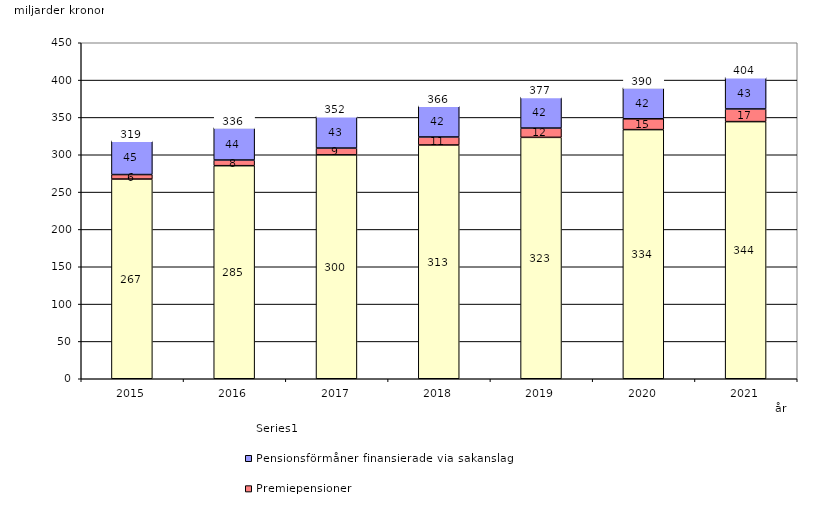
| Category | Inkomstpension och tilläggspension m.m. | Premiepensioner | Pensionsförmåner finansierade via sakanslag | Series 0 |
|---|---|---|---|---|
| 2015.0 | 267.466 | 6.008 | 45.361 | 20 |
| 2016.0 | 285.357 | 7.598 | 43.541 | 20 |
| 2017.0 | 299.86 | 9.107 | 42.711 | 20 |
| 2018.0 | 313.084 | 10.722 | 41.754 | 20 |
| 2019.0 | 323.304 | 12.454 | 41.585 | 20 |
| 2020.0 | 333.655 | 14.517 | 41.866 | 20 |
| 2021.0 | 344.371 | 16.98 | 42.516 | 20 |